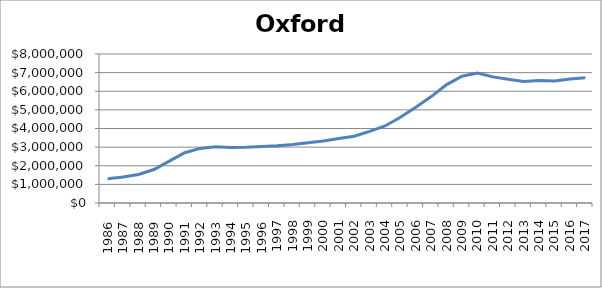
| Category | Oxford (000s) |
|---|---|
|       1986 | 1296300 |
|       1987 | 1399800 |
|       1988 | 1534650 |
|       1989 | 1796550 |
|       1990 | 2251700 |
|       1991 | 2701650 |
|       1992 | 2932300 |
|       1993 | 3016138.85 |
|       1994 | 2983050 |
|       1995 | 2992350 |
|       1996 | 3037650 |
| 1997 | 3071000 |
| 1998 | 3136850 |
| 1999 | 3230600 |
| 2000 | 3326450 |
| 2001 | 3468350 |
| 2002 | 3581000 |
| 2003 | 3843100 |
| 2004 | 4135150 |
| 2005 | 4605900 |
| 2006 | 5140650 |
| 2007 | 5713000 |
| 2008 | 6358650 |
| 2009 | 6805400 |
| 2010 | 6976550 |
| 2011 | 6772200 |
| 2012 | 6640850 |
| 2013 | 6530200 |
| 2014 | 6582950 |
| 2015 | 6556600 |
| 2016 | 6657000 |
| 2017 | 6729800 |